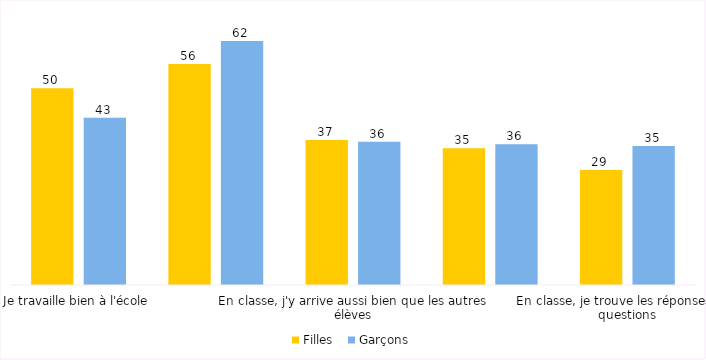
| Category | Filles  | Garçons |
|---|---|---|
| Je travaille bien à l'école | 50.1 | 42.6 |
| Je suis content de moi | 56.24 | 62.1 |
| En classe, j'y arrive aussi bien que les autres élèves | 36.89 | 36.48 |
| Je me rappelle facilement ce que j'apprends à l'école | 34.8 | 35.82 |
| En classe, je trouve les réponses aux questions | 29.27 | 35.36 |